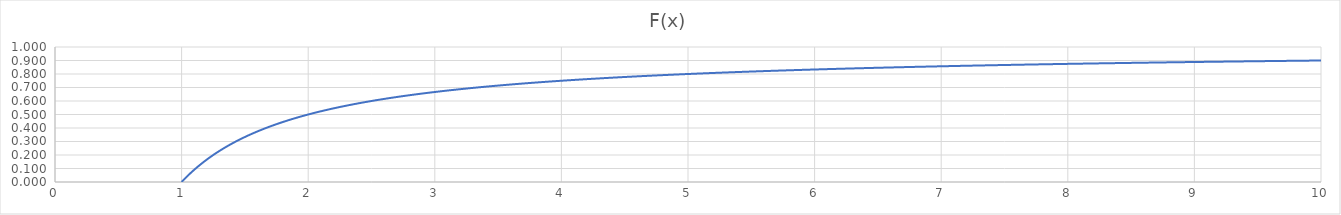
| Category | Series 0 |
|---|---|
| 1.0 | 0 |
| 1.01 | 0.01 |
| 1.02 | 0.02 |
| 1.03 | 0.029 |
| 1.04 | 0.038 |
| 1.05 | 0.048 |
| 1.06 | 0.057 |
| 1.07 | 0.065 |
| 1.08 | 0.074 |
| 1.09 | 0.083 |
| 1.1 | 0.091 |
| 1.11 | 0.099 |
| 1.12 | 0.107 |
| 1.13 | 0.115 |
| 1.14 | 0.123 |
| 1.15 | 0.13 |
| 1.16 | 0.138 |
| 1.17 | 0.145 |
| 1.18 | 0.153 |
| 1.19 | 0.16 |
| 1.2 | 0.167 |
| 1.21 | 0.174 |
| 1.22 | 0.18 |
| 1.23 | 0.187 |
| 1.24 | 0.194 |
| 1.25 | 0.2 |
| 1.26 | 0.206 |
| 1.27 | 0.213 |
| 1.28 | 0.219 |
| 1.29 | 0.225 |
| 1.3 | 0.231 |
| 1.31 | 0.237 |
| 1.32 | 0.242 |
| 1.33 | 0.248 |
| 1.34 | 0.254 |
| 1.35 | 0.259 |
| 1.36 | 0.265 |
| 1.37 | 0.27 |
| 1.38 | 0.275 |
| 1.39 | 0.281 |
| 1.4 | 0.286 |
| 1.41 | 0.291 |
| 1.42 | 0.296 |
| 1.43 | 0.301 |
| 1.44 | 0.306 |
| 1.45 | 0.31 |
| 1.46 | 0.315 |
| 1.47 | 0.32 |
| 1.48 | 0.324 |
| 1.49 | 0.329 |
| 1.5 | 0.333 |
| 1.51 | 0.338 |
| 1.52 | 0.342 |
| 1.53 | 0.346 |
| 1.54 | 0.351 |
| 1.55 | 0.355 |
| 1.56 | 0.359 |
| 1.57 | 0.363 |
| 1.58 | 0.367 |
| 1.59 | 0.371 |
| 1.6 | 0.375 |
| 1.61 | 0.379 |
| 1.62 | 0.383 |
| 1.63 | 0.387 |
| 1.64 | 0.39 |
| 1.65 | 0.394 |
| 1.66 | 0.398 |
| 1.67 | 0.401 |
| 1.68 | 0.405 |
| 1.69 | 0.408 |
| 1.7 | 0.412 |
| 1.71 | 0.415 |
| 1.72 | 0.419 |
| 1.73 | 0.422 |
| 1.74 | 0.425 |
| 1.75 | 0.429 |
| 1.76 | 0.432 |
| 1.77 | 0.435 |
| 1.78 | 0.438 |
| 1.79 | 0.441 |
| 1.8 | 0.444 |
| 1.81 | 0.448 |
| 1.82 | 0.451 |
| 1.83 | 0.454 |
| 1.84 | 0.457 |
| 1.85 | 0.459 |
| 1.86 | 0.462 |
| 1.87 | 0.465 |
| 1.88 | 0.468 |
| 1.89 | 0.471 |
| 1.9 | 0.474 |
| 1.91 | 0.476 |
| 1.92 | 0.479 |
| 1.93 | 0.482 |
| 1.94 | 0.485 |
| 1.95 | 0.487 |
| 1.96 | 0.49 |
| 1.97 | 0.492 |
| 1.98 | 0.495 |
| 1.99 | 0.497 |
| 2.0 | 0.5 |
| 2.01 | 0.502 |
| 2.02 | 0.505 |
| 2.03 | 0.507 |
| 2.04 | 0.51 |
| 2.05 | 0.512 |
| 2.06 | 0.515 |
| 2.07 | 0.517 |
| 2.08 | 0.519 |
| 2.09 | 0.522 |
| 2.1 | 0.524 |
| 2.11 | 0.526 |
| 2.12 | 0.528 |
| 2.13 | 0.531 |
| 2.14 | 0.533 |
| 2.15 | 0.535 |
| 2.16 | 0.537 |
| 2.17 | 0.539 |
| 2.18 | 0.541 |
| 2.19 | 0.543 |
| 2.2 | 0.545 |
| 2.21 | 0.548 |
| 2.22 | 0.55 |
| 2.23 | 0.552 |
| 2.24 | 0.554 |
| 2.25 | 0.556 |
| 2.26 | 0.558 |
| 2.27 | 0.559 |
| 2.28 | 0.561 |
| 2.29 | 0.563 |
| 2.3 | 0.565 |
| 2.31 | 0.567 |
| 2.32 | 0.569 |
| 2.33 | 0.571 |
| 2.34 | 0.573 |
| 2.35 | 0.574 |
| 2.36 | 0.576 |
| 2.37 | 0.578 |
| 2.38 | 0.58 |
| 2.39 | 0.582 |
| 2.4 | 0.583 |
| 2.41 | 0.585 |
| 2.42 | 0.587 |
| 2.43 | 0.588 |
| 2.44 | 0.59 |
| 2.45 | 0.592 |
| 2.46 | 0.593 |
| 2.47 | 0.595 |
| 2.48 | 0.597 |
| 2.49 | 0.598 |
| 2.5 | 0.6 |
| 2.51 | 0.602 |
| 2.52 | 0.603 |
| 2.53 | 0.605 |
| 2.54 | 0.606 |
| 2.55 | 0.608 |
| 2.56 | 0.609 |
| 2.57 | 0.611 |
| 2.58 | 0.612 |
| 2.59 | 0.614 |
| 2.6 | 0.615 |
| 2.61 | 0.617 |
| 2.62 | 0.618 |
| 2.63 | 0.62 |
| 2.64 | 0.621 |
| 2.65 | 0.623 |
| 2.66 | 0.624 |
| 2.67 | 0.625 |
| 2.68 | 0.627 |
| 2.69 | 0.628 |
| 2.7 | 0.63 |
| 2.71 | 0.631 |
| 2.72 | 0.632 |
| 2.73 | 0.634 |
| 2.74 | 0.635 |
| 2.75 | 0.636 |
| 2.76 | 0.638 |
| 2.77 | 0.639 |
| 2.78 | 0.64 |
| 2.79 | 0.642 |
| 2.8 | 0.643 |
| 2.81 | 0.644 |
| 2.82 | 0.645 |
| 2.83 | 0.647 |
| 2.84 | 0.648 |
| 2.85 | 0.649 |
| 2.86 | 0.65 |
| 2.87 | 0.652 |
| 2.88 | 0.653 |
| 2.89 | 0.654 |
| 2.9 | 0.655 |
| 2.91 | 0.656 |
| 2.92 | 0.658 |
| 2.93 | 0.659 |
| 2.94 | 0.66 |
| 2.95 | 0.661 |
| 2.96 | 0.662 |
| 2.97 | 0.663 |
| 2.98 | 0.664 |
| 2.99 | 0.666 |
| 3.0 | 0.667 |
| 3.01 | 0.668 |
| 3.02 | 0.669 |
| 3.03 | 0.67 |
| 3.04 | 0.671 |
| 3.05 | 0.672 |
| 3.06 | 0.673 |
| 3.07 | 0.674 |
| 3.08 | 0.675 |
| 3.09 | 0.676 |
| 3.1 | 0.677 |
| 3.11 | 0.678 |
| 3.12 | 0.679 |
| 3.13 | 0.681 |
| 3.14 | 0.682 |
| 3.15 | 0.683 |
| 3.16 | 0.684 |
| 3.17 | 0.685 |
| 3.18 | 0.686 |
| 3.19 | 0.687 |
| 3.2 | 0.688 |
| 3.21 | 0.688 |
| 3.22 | 0.689 |
| 3.23 | 0.69 |
| 3.24 | 0.691 |
| 3.25 | 0.692 |
| 3.26 | 0.693 |
| 3.27 | 0.694 |
| 3.28 | 0.695 |
| 3.29 | 0.696 |
| 3.3 | 0.697 |
| 3.31 | 0.698 |
| 3.32 | 0.699 |
| 3.33 | 0.7 |
| 3.34 | 0.701 |
| 3.35 | 0.701 |
| 3.36 | 0.702 |
| 3.37 | 0.703 |
| 3.38 | 0.704 |
| 3.39 | 0.705 |
| 3.4 | 0.706 |
| 3.41 | 0.707 |
| 3.42 | 0.708 |
| 3.43 | 0.708 |
| 3.44 | 0.709 |
| 3.45 | 0.71 |
| 3.46 | 0.711 |
| 3.47 | 0.712 |
| 3.48 | 0.713 |
| 3.49 | 0.713 |
| 3.5 | 0.714 |
| 3.51 | 0.715 |
| 3.52 | 0.716 |
| 3.53 | 0.717 |
| 3.54 | 0.718 |
| 3.55 | 0.718 |
| 3.56 | 0.719 |
| 3.57 | 0.72 |
| 3.58 | 0.721 |
| 3.59 | 0.721 |
| 3.6 | 0.722 |
| 3.61 | 0.723 |
| 3.62 | 0.724 |
| 3.63 | 0.725 |
| 3.64 | 0.725 |
| 3.65 | 0.726 |
| 3.66 | 0.727 |
| 3.67 | 0.728 |
| 3.68 | 0.728 |
| 3.69 | 0.729 |
| 3.7 | 0.73 |
| 3.71 | 0.73 |
| 3.72 | 0.731 |
| 3.73 | 0.732 |
| 3.74 | 0.733 |
| 3.75 | 0.733 |
| 3.76 | 0.734 |
| 3.77 | 0.735 |
| 3.78 | 0.735 |
| 3.79 | 0.736 |
| 3.8 | 0.737 |
| 3.81 | 0.738 |
| 3.82 | 0.738 |
| 3.83 | 0.739 |
| 3.84 | 0.74 |
| 3.85 | 0.74 |
| 3.86 | 0.741 |
| 3.87 | 0.742 |
| 3.88 | 0.742 |
| 3.89 | 0.743 |
| 3.9 | 0.744 |
| 3.91 | 0.744 |
| 3.92 | 0.745 |
| 3.93 | 0.746 |
| 3.94 | 0.746 |
| 3.95 | 0.747 |
| 3.96 | 0.747 |
| 3.97 | 0.748 |
| 3.98 | 0.749 |
| 3.99 | 0.749 |
| 4.0 | 0.75 |
| 4.01 | 0.751 |
| 4.02 | 0.751 |
| 4.03 | 0.752 |
| 4.04 | 0.752 |
| 4.05 | 0.753 |
| 4.06 | 0.754 |
| 4.07 | 0.754 |
| 4.08 | 0.755 |
| 4.09 | 0.756 |
| 4.1 | 0.756 |
| 4.11 | 0.757 |
| 4.12 | 0.757 |
| 4.13 | 0.758 |
| 4.14 | 0.758 |
| 4.15 | 0.759 |
| 4.16 | 0.76 |
| 4.17 | 0.76 |
| 4.18 | 0.761 |
| 4.19 | 0.761 |
| 4.2 | 0.762 |
| 4.21 | 0.762 |
| 4.22 | 0.763 |
| 4.23 | 0.764 |
| 4.24 | 0.764 |
| 4.25 | 0.765 |
| 4.26 | 0.765 |
| 4.27 | 0.766 |
| 4.28 | 0.766 |
| 4.29 | 0.767 |
| 4.3 | 0.767 |
| 4.31 | 0.768 |
| 4.32 | 0.769 |
| 4.33 | 0.769 |
| 4.34 | 0.77 |
| 4.35 | 0.77 |
| 4.36 | 0.771 |
| 4.37 | 0.771 |
| 4.38 | 0.772 |
| 4.39 | 0.772 |
| 4.4 | 0.773 |
| 4.41 | 0.773 |
| 4.42 | 0.774 |
| 4.43 | 0.774 |
| 4.44 | 0.775 |
| 4.45 | 0.775 |
| 4.46 | 0.776 |
| 4.47 | 0.776 |
| 4.48 | 0.777 |
| 4.49 | 0.777 |
| 4.5 | 0.778 |
| 4.51 | 0.778 |
| 4.52 | 0.779 |
| 4.53 | 0.779 |
| 4.54 | 0.78 |
| 4.55 | 0.78 |
| 4.56 | 0.781 |
| 4.57 | 0.781 |
| 4.58 | 0.782 |
| 4.59 | 0.782 |
| 4.6 | 0.783 |
| 4.61 | 0.783 |
| 4.62 | 0.784 |
| 4.63 | 0.784 |
| 4.64 | 0.784 |
| 4.65 | 0.785 |
| 4.66 | 0.785 |
| 4.67 | 0.786 |
| 4.68 | 0.786 |
| 4.69 | 0.787 |
| 4.7 | 0.787 |
| 4.71 | 0.788 |
| 4.72 | 0.788 |
| 4.73 | 0.789 |
| 4.74 | 0.789 |
| 4.75 | 0.789 |
| 4.76 | 0.79 |
| 4.77 | 0.79 |
| 4.78 | 0.791 |
| 4.79 | 0.791 |
| 4.8 | 0.792 |
| 4.81 | 0.792 |
| 4.82 | 0.793 |
| 4.83 | 0.793 |
| 4.84 | 0.793 |
| 4.85 | 0.794 |
| 4.86 | 0.794 |
| 4.87 | 0.795 |
| 4.88 | 0.795 |
| 4.89 | 0.796 |
| 4.9 | 0.796 |
| 4.91 | 0.796 |
| 4.92 | 0.797 |
| 4.93 | 0.797 |
| 4.94 | 0.798 |
| 4.95 | 0.798 |
| 4.96 | 0.798 |
| 4.97 | 0.799 |
| 4.98 | 0.799 |
| 4.99 | 0.8 |
| 5.0 | 0.8 |
| 5.01 | 0.8 |
| 5.02 | 0.801 |
| 5.03 | 0.801 |
| 5.04 | 0.802 |
| 5.05 | 0.802 |
| 5.06 | 0.802 |
| 5.07 | 0.803 |
| 5.08 | 0.803 |
| 5.09 | 0.804 |
| 5.1 | 0.804 |
| 5.11 | 0.804 |
| 5.12 | 0.805 |
| 5.13 | 0.805 |
| 5.14 | 0.805 |
| 5.15 | 0.806 |
| 5.16 | 0.806 |
| 5.17 | 0.807 |
| 5.18 | 0.807 |
| 5.19 | 0.807 |
| 5.2 | 0.808 |
| 5.21 | 0.808 |
| 5.22 | 0.808 |
| 5.23 | 0.809 |
| 5.24 | 0.809 |
| 5.25 | 0.81 |
| 5.26 | 0.81 |
| 5.27 | 0.81 |
| 5.28 | 0.811 |
| 5.29 | 0.811 |
| 5.3 | 0.811 |
| 5.31 | 0.812 |
| 5.32 | 0.812 |
| 5.33 | 0.812 |
| 5.34 | 0.813 |
| 5.35 | 0.813 |
| 5.36 | 0.813 |
| 5.37 | 0.814 |
| 5.38 | 0.814 |
| 5.39 | 0.814 |
| 5.4 | 0.815 |
| 5.41 | 0.815 |
| 5.42 | 0.815 |
| 5.43 | 0.816 |
| 5.44 | 0.816 |
| 5.45 | 0.817 |
| 5.46 | 0.817 |
| 5.47 | 0.817 |
| 5.48 | 0.818 |
| 5.49 | 0.818 |
| 5.5 | 0.818 |
| 5.51 | 0.819 |
| 5.52 | 0.819 |
| 5.53 | 0.819 |
| 5.54 | 0.819 |
| 5.55 | 0.82 |
| 5.56 | 0.82 |
| 5.57 | 0.82 |
| 5.58 | 0.821 |
| 5.59 | 0.821 |
| 5.6 | 0.821 |
| 5.61 | 0.822 |
| 5.62 | 0.822 |
| 5.63 | 0.822 |
| 5.64 | 0.823 |
| 5.65 | 0.823 |
| 5.66 | 0.823 |
| 5.67 | 0.824 |
| 5.68 | 0.824 |
| 5.69 | 0.824 |
| 5.7 | 0.825 |
| 5.71 | 0.825 |
| 5.72 | 0.825 |
| 5.73 | 0.825 |
| 5.74 | 0.826 |
| 5.75 | 0.826 |
| 5.76 | 0.826 |
| 5.77 | 0.827 |
| 5.78 | 0.827 |
| 5.79 | 0.827 |
| 5.8 | 0.828 |
| 5.81 | 0.828 |
| 5.82 | 0.828 |
| 5.83 | 0.828 |
| 5.84 | 0.829 |
| 5.85 | 0.829 |
| 5.86 | 0.829 |
| 5.87 | 0.83 |
| 5.88 | 0.83 |
| 5.89 | 0.83 |
| 5.9 | 0.831 |
| 5.91 | 0.831 |
| 5.92 | 0.831 |
| 5.93 | 0.831 |
| 5.94 | 0.832 |
| 5.95 | 0.832 |
| 5.96 | 0.832 |
| 5.97 | 0.832 |
| 5.98 | 0.833 |
| 5.99 | 0.833 |
| 6.0 | 0.833 |
| 6.01 | 0.834 |
| 6.02 | 0.834 |
| 6.03 | 0.834 |
| 6.04 | 0.834 |
| 6.05 | 0.835 |
| 6.06 | 0.835 |
| 6.07 | 0.835 |
| 6.08 | 0.836 |
| 6.09 | 0.836 |
| 6.1 | 0.836 |
| 6.11 | 0.836 |
| 6.12 | 0.837 |
| 6.13 | 0.837 |
| 6.14 | 0.837 |
| 6.15 | 0.837 |
| 6.16 | 0.838 |
| 6.17 | 0.838 |
| 6.18000000000001 | 0.838 |
| 6.19 | 0.838 |
| 6.2 | 0.839 |
| 6.21 | 0.839 |
| 6.22 | 0.839 |
| 6.23 | 0.839 |
| 6.24 | 0.84 |
| 6.25 | 0.84 |
| 6.26000000000001 | 0.84 |
| 6.27 | 0.841 |
| 6.28 | 0.841 |
| 6.29 | 0.841 |
| 6.3 | 0.841 |
| 6.31 | 0.842 |
| 6.32 | 0.842 |
| 6.33 | 0.842 |
| 6.34000000000001 | 0.842 |
| 6.35 | 0.843 |
| 6.36 | 0.843 |
| 6.37 | 0.843 |
| 6.38 | 0.843 |
| 6.39000000000001 | 0.844 |
| 6.4 | 0.844 |
| 6.41 | 0.844 |
| 6.42000000000001 | 0.844 |
| 6.43000000000001 | 0.844 |
| 6.44 | 0.845 |
| 6.45 | 0.845 |
| 6.46 | 0.845 |
| 6.47000000000001 | 0.845 |
| 6.48 | 0.846 |
| 6.49 | 0.846 |
| 6.50000000000001 | 0.846 |
| 6.51000000000001 | 0.846 |
| 6.52 | 0.847 |
| 6.53 | 0.847 |
| 6.54 | 0.847 |
| 6.55000000000001 | 0.847 |
| 6.56 | 0.848 |
| 6.57 | 0.848 |
| 6.58000000000001 | 0.848 |
| 6.59000000000001 | 0.848 |
| 6.6 | 0.848 |
| 6.61 | 0.849 |
| 6.62 | 0.849 |
| 6.63000000000001 | 0.849 |
| 6.64000000000001 | 0.849 |
| 6.65 | 0.85 |
| 6.66000000000001 | 0.85 |
| 6.67000000000001 | 0.85 |
| 6.68000000000001 | 0.85 |
| 6.69 | 0.851 |
| 6.7 | 0.851 |
| 6.71000000000001 | 0.851 |
| 6.72000000000001 | 0.851 |
| 6.73 | 0.851 |
| 6.74000000000001 | 0.852 |
| 6.75000000000001 | 0.852 |
| 6.76000000000001 | 0.852 |
| 6.77 | 0.852 |
| 6.78 | 0.853 |
| 6.79000000000001 | 0.853 |
| 6.80000000000001 | 0.853 |
| 6.81 | 0.853 |
| 6.82000000000001 | 0.853 |
| 6.83000000000001 | 0.854 |
| 6.84000000000001 | 0.854 |
| 6.85 | 0.854 |
| 6.86 | 0.854 |
| 6.87000000000001 | 0.854 |
| 6.88000000000001 | 0.855 |
| 6.89000000000001 | 0.855 |
| 6.90000000000001 | 0.855 |
| 6.91000000000001 | 0.855 |
| 6.92000000000001 | 0.855 |
| 6.93000000000001 | 0.856 |
| 6.94 | 0.856 |
| 6.95000000000001 | 0.856 |
| 6.96000000000001 | 0.856 |
| 6.97000000000001 | 0.857 |
| 6.98000000000001 | 0.857 |
| 6.99000000000001 | 0.857 |
| 7.00000000000001 | 0.857 |
| 7.01000000000001 | 0.857 |
| 7.02 | 0.858 |
| 7.03000000000001 | 0.858 |
| 7.04000000000001 | 0.858 |
| 7.05000000000001 | 0.858 |
| 7.06000000000001 | 0.858 |
| 7.07000000000001 | 0.859 |
| 7.08000000000001 | 0.859 |
| 7.09000000000001 | 0.859 |
| 7.1 | 0.859 |
| 7.11000000000001 | 0.859 |
| 7.12000000000001 | 0.86 |
| 7.13000000000001 | 0.86 |
| 7.14000000000001 | 0.86 |
| 7.15000000000001 | 0.86 |
| 7.16000000000001 | 0.86 |
| 7.17000000000001 | 0.861 |
| 7.18000000000001 | 0.861 |
| 7.19000000000001 | 0.861 |
| 7.20000000000001 | 0.861 |
| 7.21000000000001 | 0.861 |
| 7.22000000000001 | 0.861 |
| 7.23000000000001 | 0.862 |
| 7.24000000000001 | 0.862 |
| 7.25000000000001 | 0.862 |
| 7.26000000000001 | 0.862 |
| 7.27000000000001 | 0.862 |
| 7.28000000000001 | 0.863 |
| 7.29000000000001 | 0.863 |
| 7.30000000000001 | 0.863 |
| 7.31000000000001 | 0.863 |
| 7.32000000000001 | 0.863 |
| 7.33000000000001 | 0.864 |
| 7.34000000000001 | 0.864 |
| 7.35000000000001 | 0.864 |
| 7.36000000000001 | 0.864 |
| 7.37000000000001 | 0.864 |
| 7.38000000000001 | 0.864 |
| 7.39000000000001 | 0.865 |
| 7.40000000000001 | 0.865 |
| 7.41000000000001 | 0.865 |
| 7.42000000000001 | 0.865 |
| 7.43000000000001 | 0.865 |
| 7.44000000000001 | 0.866 |
| 7.45000000000001 | 0.866 |
| 7.46000000000001 | 0.866 |
| 7.47000000000001 | 0.866 |
| 7.48000000000001 | 0.866 |
| 7.49000000000001 | 0.866 |
| 7.50000000000001 | 0.867 |
| 7.51000000000001 | 0.867 |
| 7.52000000000001 | 0.867 |
| 7.53000000000001 | 0.867 |
| 7.54000000000001 | 0.867 |
| 7.55000000000001 | 0.868 |
| 7.56000000000001 | 0.868 |
| 7.57000000000001 | 0.868 |
| 7.58000000000001 | 0.868 |
| 7.59000000000001 | 0.868 |
| 7.60000000000001 | 0.868 |
| 7.61000000000001 | 0.869 |
| 7.62000000000001 | 0.869 |
| 7.63000000000001 | 0.869 |
| 7.64000000000001 | 0.869 |
| 7.65000000000001 | 0.869 |
| 7.66000000000001 | 0.869 |
| 7.67000000000001 | 0.87 |
| 7.68000000000001 | 0.87 |
| 7.69000000000001 | 0.87 |
| 7.70000000000001 | 0.87 |
| 7.71000000000001 | 0.87 |
| 7.72000000000001 | 0.87 |
| 7.73000000000001 | 0.871 |
| 7.74000000000001 | 0.871 |
| 7.75000000000001 | 0.871 |
| 7.76000000000001 | 0.871 |
| 7.77000000000001 | 0.871 |
| 7.78000000000001 | 0.871 |
| 7.79000000000001 | 0.872 |
| 7.80000000000001 | 0.872 |
| 7.81000000000001 | 0.872 |
| 7.82000000000001 | 0.872 |
| 7.83000000000001 | 0.872 |
| 7.84000000000001 | 0.872 |
| 7.85000000000001 | 0.873 |
| 7.86000000000001 | 0.873 |
| 7.87000000000001 | 0.873 |
| 7.88000000000001 | 0.873 |
| 7.89000000000001 | 0.873 |
| 7.90000000000001 | 0.873 |
| 7.91000000000001 | 0.874 |
| 7.92000000000001 | 0.874 |
| 7.93000000000001 | 0.874 |
| 7.94000000000001 | 0.874 |
| 7.95000000000001 | 0.874 |
| 7.96000000000001 | 0.874 |
| 7.97000000000001 | 0.875 |
| 7.98000000000001 | 0.875 |
| 7.99000000000001 | 0.875 |
| 8.00000000000001 | 0.875 |
| 8.01000000000001 | 0.875 |
| 8.02000000000001 | 0.875 |
| 8.03000000000001 | 0.875 |
| 8.04000000000001 | 0.876 |
| 8.05000000000001 | 0.876 |
| 8.06000000000001 | 0.876 |
| 8.07000000000001 | 0.876 |
| 8.08000000000001 | 0.876 |
| 8.09000000000001 | 0.876 |
| 8.10000000000001 | 0.877 |
| 8.11000000000001 | 0.877 |
| 8.12000000000001 | 0.877 |
| 8.13000000000001 | 0.877 |
| 8.14000000000001 | 0.877 |
| 8.15000000000001 | 0.877 |
| 8.16000000000001 | 0.877 |
| 8.17000000000001 | 0.878 |
| 8.18000000000001 | 0.878 |
| 8.19000000000001 | 0.878 |
| 8.20000000000001 | 0.878 |
| 8.21000000000001 | 0.878 |
| 8.22000000000001 | 0.878 |
| 8.23000000000001 | 0.878 |
| 8.24000000000001 | 0.879 |
| 8.25000000000001 | 0.879 |
| 8.26000000000001 | 0.879 |
| 8.27000000000001 | 0.879 |
| 8.28000000000001 | 0.879 |
| 8.29000000000001 | 0.879 |
| 8.30000000000001 | 0.88 |
| 8.31000000000001 | 0.88 |
| 8.32000000000001 | 0.88 |
| 8.33000000000001 | 0.88 |
| 8.34000000000001 | 0.88 |
| 8.35000000000001 | 0.88 |
| 8.36000000000001 | 0.88 |
| 8.37000000000001 | 0.881 |
| 8.38000000000001 | 0.881 |
| 8.39000000000001 | 0.881 |
| 8.40000000000001 | 0.881 |
| 8.41000000000001 | 0.881 |
| 8.42000000000001 | 0.881 |
| 8.43000000000001 | 0.881 |
| 8.44000000000001 | 0.882 |
| 8.45000000000001 | 0.882 |
| 8.46000000000001 | 0.882 |
| 8.47000000000001 | 0.882 |
| 8.48000000000001 | 0.882 |
| 8.49000000000001 | 0.882 |
| 8.50000000000001 | 0.882 |
| 8.51000000000001 | 0.882 |
| 8.52000000000001 | 0.883 |
| 8.53000000000001 | 0.883 |
| 8.54000000000001 | 0.883 |
| 8.55000000000001 | 0.883 |
| 8.56000000000001 | 0.883 |
| 8.57000000000001 | 0.883 |
| 8.58000000000001 | 0.883 |
| 8.59000000000001 | 0.884 |
| 8.60000000000001 | 0.884 |
| 8.61000000000001 | 0.884 |
| 8.62000000000001 | 0.884 |
| 8.63000000000001 | 0.884 |
| 8.64000000000001 | 0.884 |
| 8.65000000000001 | 0.884 |
| 8.66000000000001 | 0.885 |
| 8.67000000000001 | 0.885 |
| 8.68000000000001 | 0.885 |
| 8.69000000000001 | 0.885 |
| 8.70000000000001 | 0.885 |
| 8.71000000000001 | 0.885 |
| 8.72000000000001 | 0.885 |
| 8.73000000000001 | 0.885 |
| 8.74000000000001 | 0.886 |
| 8.75000000000001 | 0.886 |
| 8.76000000000001 | 0.886 |
| 8.77000000000001 | 0.886 |
| 8.78000000000001 | 0.886 |
| 8.79000000000001 | 0.886 |
| 8.80000000000001 | 0.886 |
| 8.81000000000001 | 0.886 |
| 8.82000000000001 | 0.887 |
| 8.83000000000001 | 0.887 |
| 8.84000000000001 | 0.887 |
| 8.85000000000001 | 0.887 |
| 8.86000000000001 | 0.887 |
| 8.87000000000001 | 0.887 |
| 8.88000000000001 | 0.887 |
| 8.89000000000001 | 0.888 |
| 8.90000000000001 | 0.888 |
| 8.91000000000001 | 0.888 |
| 8.92000000000001 | 0.888 |
| 8.93000000000001 | 0.888 |
| 8.94000000000001 | 0.888 |
| 8.95000000000001 | 0.888 |
| 8.96000000000001 | 0.888 |
| 8.97000000000001 | 0.889 |
| 8.98000000000001 | 0.889 |
| 8.99000000000001 | 0.889 |
| 9.00000000000001 | 0.889 |
| 9.01000000000001 | 0.889 |
| 9.02000000000001 | 0.889 |
| 9.03000000000001 | 0.889 |
| 9.04000000000001 | 0.889 |
| 9.05000000000001 | 0.89 |
| 9.06000000000001 | 0.89 |
| 9.07000000000001 | 0.89 |
| 9.08000000000001 | 0.89 |
| 9.09000000000001 | 0.89 |
| 9.10000000000001 | 0.89 |
| 9.11000000000001 | 0.89 |
| 9.12000000000001 | 0.89 |
| 9.13000000000001 | 0.89 |
| 9.14000000000001 | 0.891 |
| 9.15000000000001 | 0.891 |
| 9.16000000000001 | 0.891 |
| 9.17000000000001 | 0.891 |
| 9.18000000000001 | 0.891 |
| 9.19000000000001 | 0.891 |
| 9.20000000000001 | 0.891 |
| 9.21000000000001 | 0.891 |
| 9.22000000000001 | 0.892 |
| 9.23000000000001 | 0.892 |
| 9.24000000000001 | 0.892 |
| 9.25000000000001 | 0.892 |
| 9.26000000000001 | 0.892 |
| 9.27000000000001 | 0.892 |
| 9.28000000000001 | 0.892 |
| 9.29000000000001 | 0.892 |
| 9.30000000000001 | 0.892 |
| 9.31000000000001 | 0.893 |
| 9.32000000000001 | 0.893 |
| 9.33000000000001 | 0.893 |
| 9.34000000000001 | 0.893 |
| 9.35000000000001 | 0.893 |
| 9.36000000000001 | 0.893 |
| 9.37000000000001 | 0.893 |
| 9.38000000000001 | 0.893 |
| 9.39000000000001 | 0.894 |
| 9.40000000000001 | 0.894 |
| 9.41000000000001 | 0.894 |
| 9.42000000000001 | 0.894 |
| 9.43000000000001 | 0.894 |
| 9.44000000000001 | 0.894 |
| 9.45000000000001 | 0.894 |
| 9.46000000000001 | 0.894 |
| 9.47000000000001 | 0.894 |
| 9.48000000000001 | 0.895 |
| 9.49000000000001 | 0.895 |
| 9.50000000000001 | 0.895 |
| 9.51000000000001 | 0.895 |
| 9.52000000000001 | 0.895 |
| 9.53000000000001 | 0.895 |
| 9.54000000000001 | 0.895 |
| 9.55000000000001 | 0.895 |
| 9.56000000000001 | 0.895 |
| 9.57000000000001 | 0.896 |
| 9.58000000000001 | 0.896 |
| 9.59000000000001 | 0.896 |
| 9.60000000000001 | 0.896 |
| 9.61000000000001 | 0.896 |
| 9.62000000000001 | 0.896 |
| 9.63000000000001 | 0.896 |
| 9.64000000000001 | 0.896 |
| 9.65000000000001 | 0.896 |
| 9.66000000000001 | 0.896 |
| 9.67000000000001 | 0.897 |
| 9.68000000000001 | 0.897 |
| 9.69000000000001 | 0.897 |
| 9.70000000000001 | 0.897 |
| 9.71000000000001 | 0.897 |
| 9.72000000000001 | 0.897 |
| 9.73000000000001 | 0.897 |
| 9.74000000000001 | 0.897 |
| 9.75000000000001 | 0.897 |
| 9.76000000000001 | 0.898 |
| 9.77000000000001 | 0.898 |
| 9.78000000000001 | 0.898 |
| 9.79000000000001 | 0.898 |
| 9.80000000000001 | 0.898 |
| 9.81000000000001 | 0.898 |
| 9.82000000000001 | 0.898 |
| 9.83000000000001 | 0.898 |
| 9.84000000000001 | 0.898 |
| 9.85000000000001 | 0.898 |
| 9.86000000000001 | 0.899 |
| 9.87000000000001 | 0.899 |
| 9.88000000000001 | 0.899 |
| 9.89000000000001 | 0.899 |
| 9.90000000000001 | 0.899 |
| 9.91000000000001 | 0.899 |
| 9.92000000000001 | 0.899 |
| 9.93000000000001 | 0.899 |
| 9.94000000000001 | 0.899 |
| 9.95000000000001 | 0.899 |
| 9.96000000000001 | 0.9 |
| 9.97000000000001 | 0.9 |
| 9.98000000000001 | 0.9 |
| 9.99000000000001 | 0.9 |
| 10.0 | 0.9 |